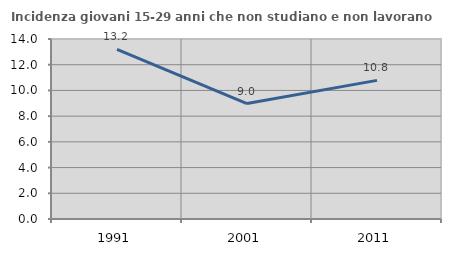
| Category | Incidenza giovani 15-29 anni che non studiano e non lavorano  |
|---|---|
| 1991.0 | 13.191 |
| 2001.0 | 8.978 |
| 2011.0 | 10.781 |